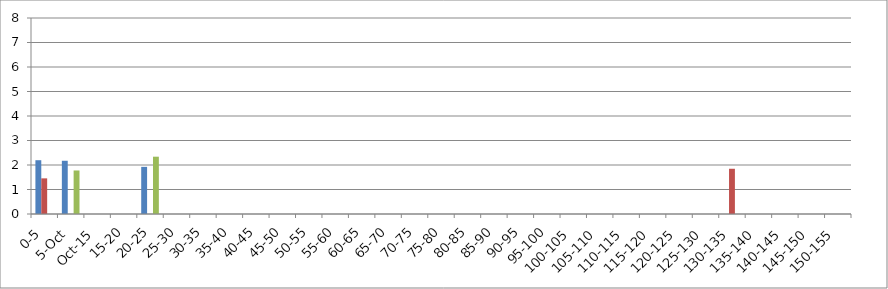
| Category | 119875 | 146067 | 241240 |
|---|---|---|---|
| 0-5 | 2.195 | 1.455 | 0 |
| 5-Oct | 2.173 | 0 | 1.777 |
| Oct-15 | 0 | 0 | 0 |
| 15-20 | 0 | 0 | 0 |
| 20-25 | 1.924 | 0 | 2.339 |
| 25-30 | 0 | 0 | 0 |
| 30-35 | 0 | 0 | 0 |
| 35-40 | 0 | 0 | 0 |
| 40-45 | 0 | 0 | 0 |
| 45-50 | 0 | 0 | 0 |
| 50-55 | 0 | 0 | 0 |
| 55-60 | 0 | 0 | 0 |
| 60-65 | 0 | 0 | 0 |
| 65-70 | 0 | 0 | 0 |
| 70-75 | 0 | 0 | 0 |
| 75-80 | 0 | 0 | 0 |
| 80-85 | 0 | 0 | 0 |
| 85-90 | 0 | 0 | 0 |
| 90-95 | 0 | 0 | 0 |
| 95-100 | 0 | 0 | 0 |
| 100-105 | 0 | 0 | 0 |
| 105-110 | 0 | 0 | 0 |
| 110-115 | 0 | 0 | 0 |
| 115-120 | 0 | 0 | 0 |
| 120-125 | 0 | 0 | 0 |
| 125-130 | 0 | 0 | 0 |
| 130-135 | 0 | 1.846 | 0 |
| 135-140 | 0 | 0 | 0 |
| 140-145 | 0 | 0 | 0 |
| 145-150 | 0 | 0 | 0 |
| 150-155 | 0 | 0 | 0 |